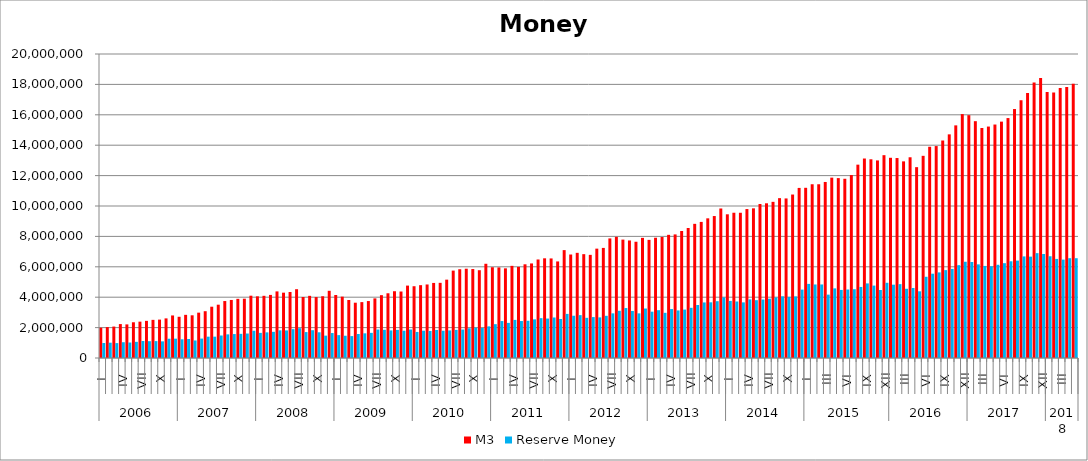
| Category | M3 | Reserve Money |
|---|---|---|
| 0 | 1993635.252 | 985529.837 |
| 1 | 2034234.826 | 1006861.291 |
| 2 | 2068041.342 | 981188.537 |
| 3 | 2231719.944 | 1037670.32 |
| 4 | 2211726.006 | 1017229.525 |
| 5 | 2350643.488 | 1063055.584 |
| 6 | 2391487.856 | 1117976.357 |
| 7 | 2443084.258 | 1106750.341 |
| 8 | 2508732.57 | 1112012.223 |
| 9 | 2525728.196 | 1095465.011 |
| 10 | 2606222.861 | 1267573.815 |
| 11 | 2799779.664 | 1272098.537 |
| 12 | 2712080.574 | 1232053.134 |
| 13 | 2839247.957 | 1248398.16 |
| 14 | 2809129.727 | 1153980.424 |
| 15 | 2983302.624 | 1277207.234 |
| 16 | 3078896.375 | 1403307.841 |
| 17 | 3374827.695 | 1404077.538 |
| 18 | 3507235.628 | 1479672.329 |
| 19 | 3747060.191 | 1555771.96 |
| 20 | 3818751.76 | 1574900.45 |
| 21 | 3892352.971 | 1588923.076 |
| 22 | 3901496.079 | 1610500.365 |
| 23 | 4098857.212 | 1793802.01 |
| 24 | 4058253.618 | 1652937.267 |
| 25 | 4091244.212 | 1686843.876 |
| 26 | 4150553.585 | 1722001.473 |
| 27 | 4381379.554 | 1820171.278 |
| 28 | 4298190.088 | 1815126.575 |
| 29 | 4341414.027 | 1897531.247 |
| 30 | 4525406.244 | 1960868.235 |
| 31 | 4014687.917 | 1706188.166 |
| 32 | 4089682.299 | 1828526.98 |
| 33 | 4009512.363 | 1691326.122 |
| 34 | 4062943.074 | 1470551.675 |
| 35 | 4421698.466 | 1642080.787 |
| 36 | 4146756.21 | 1505078.055 |
| 37 | 4035788.433 | 1464069.396 |
| 38 | 3815625.073 | 1441942.103 |
| 39 | 3637932.132 | 1578292.367 |
| 40 | 3676519.248 | 1622579.421 |
| 41 | 3746883.705 | 1654014.811 |
| 42 | 3922696.007 | 1872828.703 |
| 43 | 4133600.643 | 1856192.394 |
| 44 | 4258468.82 | 1815233.312 |
| 45 | 4392845.734 | 1850711.225 |
| 46 | 4374192.684 | 1794464.923 |
| 47 | 4763606.912 | 1874961.354 |
| 48 | 4721982.505 | 1713536.285 |
| 49 | 4792163.56 | 1796688.9 |
| 50 | 4837431.557 | 1779992.609 |
| 51 | 4938622.79 | 1840471.316 |
| 52 | 4945487.009 | 1794174.909 |
| 53 | 5154387.443 | 1814725.803 |
| 54 | 5750227.904 | 1850494.326 |
| 55 | 5840047.26 | 1871816.662 |
| 56 | 5874149.127 | 1954729.072 |
| 57 | 5852007.985 | 1997836.737 |
| 58 | 5775636.555 | 1975036.135 |
| 59 | 6199008.806 | 2081128.752 |
| 60 | 5970729.983 | 2226103.832 |
| 61 | 5959087.97 | 2430168.133 |
| 62 | 5899005.704 | 2311380.782 |
| 63 | 6062639.273 | 2505955.775 |
| 64 | 5995136.02 | 2432249.082 |
| 65 | 6164201.229 | 2448706.203 |
| 66 | 6221284.913 | 2542648.036 |
| 67 | 6481689.318 | 2621687.544 |
| 68 | 6558253.631 | 2595533.261 |
| 69 | 6550014.362 | 2664580.778 |
| 70 | 6352920.652 | 2566552.114 |
| 71 | 7097777.273 | 2901038.828 |
| 72 | 6808396.175 | 2780440.849 |
| 73 | 6918705.592 | 2819931.093 |
| 74 | 6831744.234 | 2642386.812 |
| 75 | 6785908.965 | 2691389.762 |
| 76 | 7194518.793 | 2671575.273 |
| 77 | 7242926.553 | 2775361.632 |
| 78 | 7867540.374 | 2937987.976 |
| 79 | 7971705.487 | 3107541.586 |
| 80 | 7789118.852 | 3285540.123 |
| 81 | 7732668.513 | 3094823.14 |
| 82 | 7648449.547 | 2937213.459 |
| 83 | 7903738.971 | 3255313.659 |
| 84 | 7771222.7 | 3047796.187 |
| 85 | 7912345.956 | 3146225.813 |
| 86 | 7959105.687 | 2972028.987 |
| 87 | 8103469.276 | 3220089.371 |
| 88 | 8130730.824 | 3129434.801 |
| 89 | 8354699.149 | 3184262.276 |
| 90 | 8553410.296 | 3302037.366 |
| 91 | 8826582.176 | 3487678.696 |
| 92 | 8953801.477 | 3655478.769 |
| 93 | 9188613.332 | 3663277.537 |
| 94 | 9339568.079 | 3737236.26 |
| 95 | 9836618.601 | 3989083.317 |
| 96 | 9453972.937 | 3756141.816 |
| 97 | 9556546.423 | 3717320.784 |
| 98 | 9555304.952 | 3659706.219 |
| 99 | 9799048.091 | 3855909.639 |
| 100 | 9846212.502 | 3804159.071 |
| 101 | 10130909.316 | 3846993.656 |
| 102 | 10178205.898 | 3901000.343 |
| 103 | 10273632.539 | 3988861.155 |
| 104 | 10516743.129 | 4056513.111 |
| 105 | 10497444.423 | 4020878.96 |
| 106 | 10754604.791 | 4050811.645 |
| 107 | 11189835.906 | 4501009.92 |
| 108 | 11197675.774 | 4875122.328 |
| 109 | 11430746.277 | 4837812.334 |
| 110 | 11430746.277 | 4837812.334 |
| 111 | 11581239.857 | 4169036.036 |
| 112 | 11865515.017 | 4580597.986 |
| 113 | 11835307.744 | 4478239.223 |
| 114 | 11792213.073 | 4505863.791 |
| 115 | 12034462.526 | 4525163.426 |
| 116 | 12720190.151 | 4674624.879 |
| 117 | 13124203.995 | 4907397.413 |
| 118 | 13073662.228 | 4763122.409 |
| 119 | 12998223.563 | 4474717.337 |
| 120 | 13343921.268 | 4948158.146 |
| 121 | 13172033.37 | 4823667.329 |
| 122 | 13155832.444 | 4858795.624 |
| 123 | 12936581.332 | 4553776.684 |
| 124 | 13206213.457 | 4606530.89 |
| 125 | 12555625.602 | 4388431.419 |
| 126 | 13300944.539 | 5343112.251 |
| 127 | 13897993.631 | 5546009.052 |
| 128 | 13943466.797 | 5631585.796 |
| 129 | 14309304.721 | 5782125.992 |
| 130 | 14713510.721 | 5860814.898 |
| 131 | 15304596.052 | 6108426.466 |
| 132 | 16045200.01 | 6332535.477 |
| 133 | 15976224.093 | 6317838.859 |
| 134 | 15580104.218 | 6159989.306 |
| 135 | 15132806.692 | 6056015.159 |
| 136 | 15226347.996 | 6034338.878 |
| 137 | 15360147.87 | 6133256.108 |
| 138 | 15550758.151 | 6238062.995 |
| 139 | 15785246.683 | 6363688.254 |
| 140 | 16378805.759 | 6408158.005 |
| 141 | 16957721.336 | 6683210.873 |
| 142 | 17429301.938 | 6668622.166 |
| 143 | 18125077.324 | 6898984.047 |
| 144 | 18416278.044 | 6842923.373 |
| 145 | 17501935.182 | 6693637.928 |
| 146 | 17463278.92 | 6517959.429 |
| 147 | 17756925.753 | 6474034.831 |
| 148 | 17830710.048 | 6565140.29 |
| 149 | 18037847.494 | 6564370.705 |